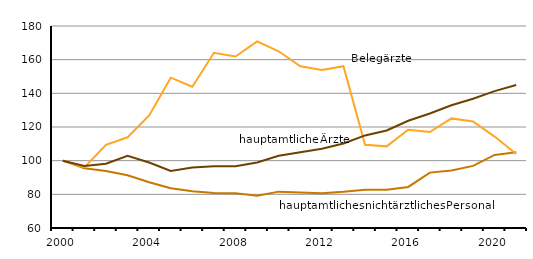
| Category | hauptamtliches nichtärztliches Personal | Belegärzte | hauptamtliche Ärzte |
|---|---|---|---|
| 2000.0 | 100 | 100 | 100 |
| 2001.0 | 95.5 | 96 | 96.8 |
| 2002.0 | 93.8 | 109.4 | 98.2 |
| 2003.0 | 91.3 | 113.9 | 102.9 |
| 2004.0 | 87.2 | 126.9 | 98.9 |
| 2005.0 | 83.6 | 149.3 | 93.9 |
| 2006.0 | 81.8 | 143.9 | 96 |
| 2007.0 | 80.8 | 164.1 | 96.7 |
| 2008.0 | 80.6 | 161.9 | 96.7 |
| 2009.0 | 79.1 | 170.9 | 98.9 |
| 2010.0 | 81.6 | 165 | 102.9 |
| 2011.0 | 81.1 | 156.1 | 105 |
| 2012.0 | 80.7 | 153.8 | 107.1 |
| 2013.0 | 81.5 | 156.1 | 110.2 |
| 2014.0 | 82.7 | 109.4 | 115 |
| 2015.0 | 82.7 | 108.5 | 117.9 |
| 2016.0 | 84.4 | 118.4 | 123.7 |
| 2017.0 | 92.9 | 117 | 128 |
| 2018.0 | 94.2 | 125.1 | 132.9 |
| 2019.0 | 96.9 | 123.3 | 136.8 |
| 2020.0 | 103.4 | 114.3 | 141.3 |
| 2021.0 | 105 | 104 | 145 |